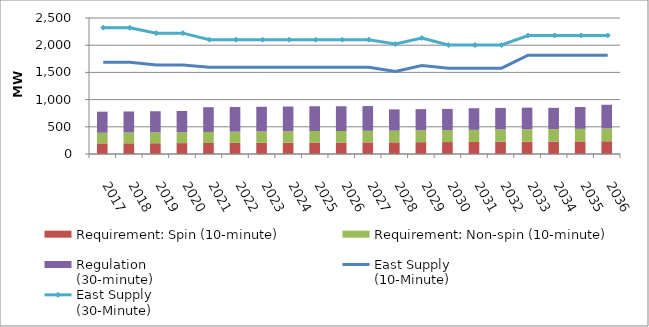
| Category | Requirement: Spin (10-minute) | Requirement: Non-spin (10-minute) | Regulation
(30-minute) |
|---|---|---|---|
| 2017.0 | 195.325 | 195.325 | 387.405 |
| 2018.0 | 197.17 | 197.17 | 387.405 |
| 2019.0 | 197.943 | 197.943 | 390.202 |
| 2020.0 | 200.211 | 200.211 | 390.202 |
| 2021.0 | 202.868 | 202.868 | 454.484 |
| 2022.0 | 205.22 | 205.22 | 454.484 |
| 2023.0 | 206.948 | 206.948 | 454.484 |
| 2024.0 | 209.042 | 209.042 | 454.484 |
| 2025.0 | 211.613 | 211.613 | 454.484 |
| 2026.0 | 211.414 | 211.414 | 454.484 |
| 2027.0 | 213.382 | 213.382 | 454.484 |
| 2028.0 | 214.967 | 214.967 | 390.144 |
| 2029.0 | 217.524 | 217.524 | 389.78 |
| 2030.0 | 219.495 | 219.495 | 389.78 |
| 2031.0 | 221.903 | 221.903 | 397.882 |
| 2032.0 | 225.369 | 225.369 | 396.049 |
| 2033.0 | 227.31 | 227.31 | 397.976 |
| 2034.0 | 228.483 | 228.483 | 391.651 |
| 2035.0 | 231.314 | 231.314 | 401.242 |
| 2036.0 | 234.57 | 234.57 | 435.837 |